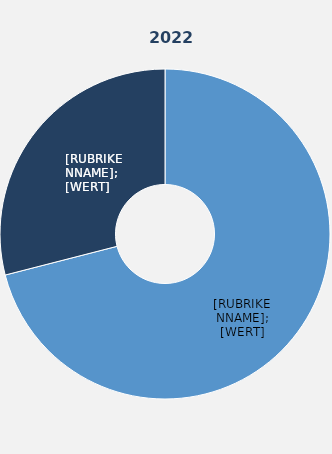
| Category | Series 1 |
|---|---|
| Vollzeitbeschäftigte | 71 |
| Teilzeitbeschäftigte | 29 |